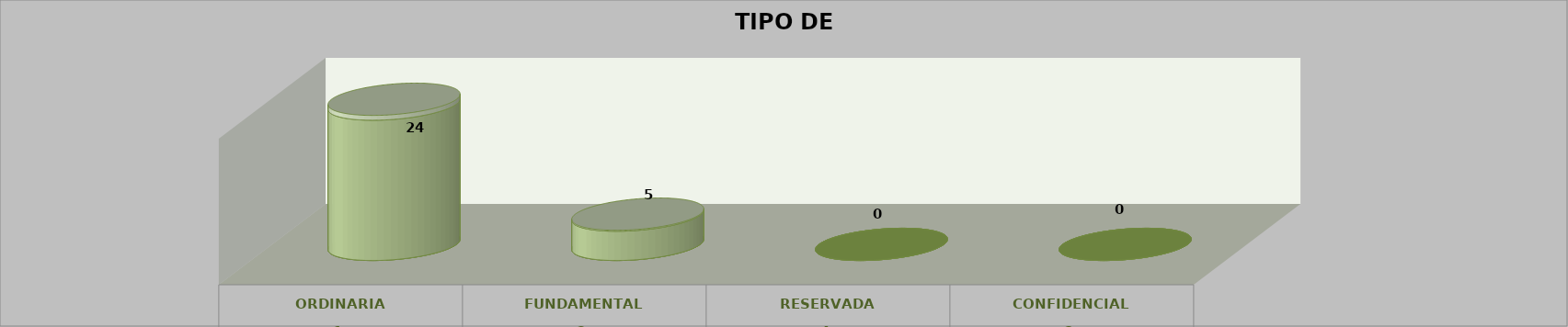
| Category | Series 0 | Series 2 | Series 1 | Series 3 | Series 4 |
|---|---|---|---|---|---|
| 0 |  |  |  | 24 | 0.828 |
| 1 |  |  |  | 5 | 0.172 |
| 2 |  |  |  | 0 | 0 |
| 3 |  |  |  | 0 | 0 |